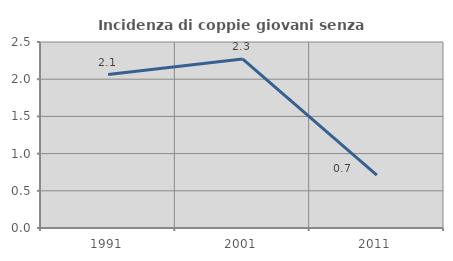
| Category | Incidenza di coppie giovani senza figli |
|---|---|
| 1991.0 | 2.062 |
| 2001.0 | 2.273 |
| 2011.0 | 0.709 |